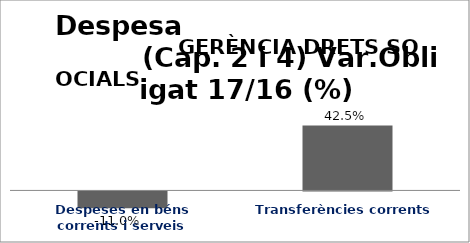
| Category | Series 0 |
|---|---|
| Despeses en béns corrents i serveis | -0.11 |
| Transferències corrents | 0.425 |